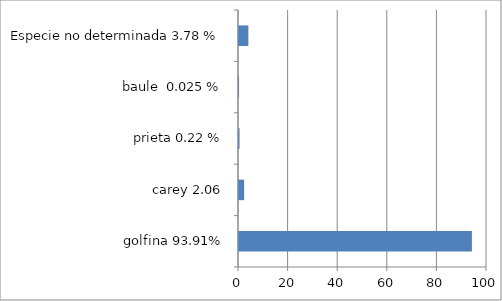
| Category | Series 0 |
|---|---|
| golfina 93.91% | 93.91 |
| carey 2.06 | 2.06 |
| prieta 0.22 % | 0.22 |
| baule  0.025 % | 0.025 |
| Especie no determinada 3.78 % | 3.78 |